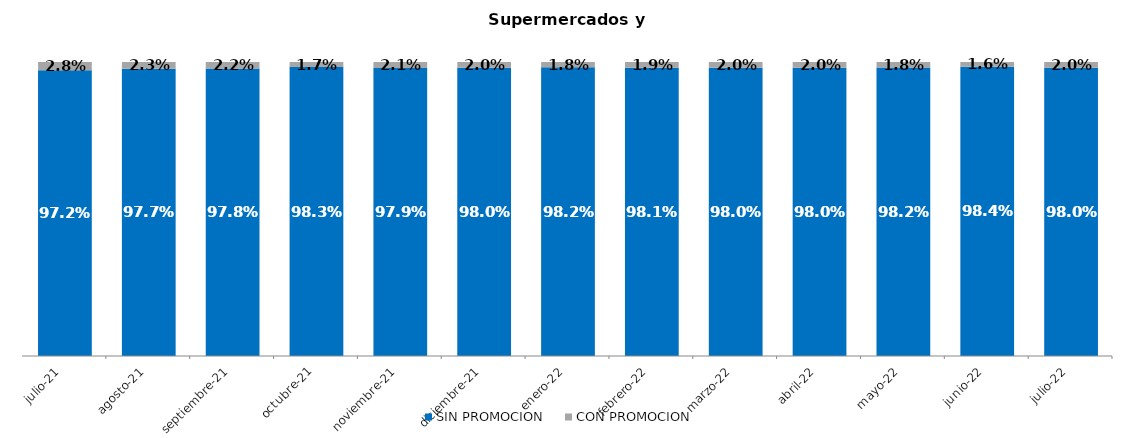
| Category | SIN PROMOCION   | CON PROMOCION   |
|---|---|---|
| 2021-07-01 | 0.972 | 0.028 |
| 2021-08-01 | 0.977 | 0.023 |
| 2021-09-01 | 0.978 | 0.022 |
| 2021-10-01 | 0.983 | 0.017 |
| 2021-11-01 | 0.979 | 0.021 |
| 2021-12-01 | 0.98 | 0.02 |
| 2022-01-01 | 0.982 | 0.018 |
| 2022-02-01 | 0.981 | 0.019 |
| 2022-03-01 | 0.98 | 0.02 |
| 2022-04-01 | 0.98 | 0.02 |
| 2022-05-01 | 0.982 | 0.018 |
| 2022-06-01 | 0.984 | 0.016 |
| 2022-07-01 | 0.98 | 0.02 |